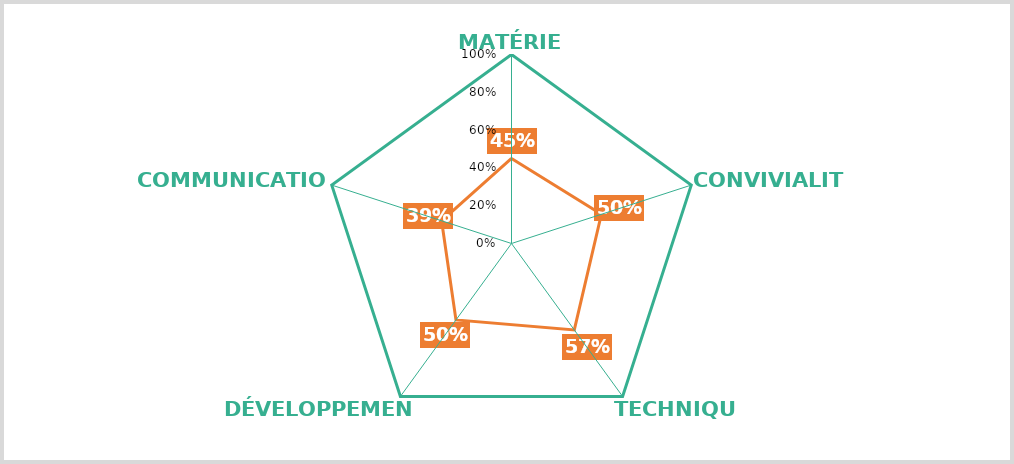
| Category | Series 0 | Series 1 |
|---|---|---|
| MATÉRIEL | 1 | 0.45 |
| CONVIVIALITÉ | 1 | 0.5 |
| TECHNIQUE | 1 | 0.565 |
| DÉVELOPPEMENT | 1 | 0.5 |
| COMMUNICATION | 1 | 0.389 |